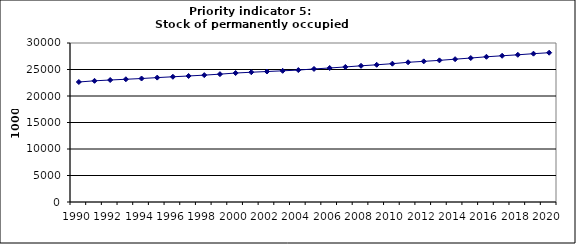
| Category | Stock of permanently occupied dwellings, 1000 |
|---|---|
| 1990 | 22643.922 |
| 1991 | 22862.734 |
| 1992 | 23016.502 |
| 1993 | 23159.711 |
| 1994 | 23298.46 |
| 1995 | 23470.105 |
| 1996 | 23627.609 |
| 1997 | 23777.987 |
| 1998 | 23937.522 |
| 1999 | 24122.857 |
| 2000 | 24333.192 |
| 2001 | 24484.813 |
| 2002 | 24619.142 |
| 2003 | 24752.205 |
| 2004 | 24891.899 |
| 2005 | 25103.747 |
| 2006 | 25287.556 |
| 2007 | 25482.153 |
| 2008 | 25696.72 |
| 2009 | 25888.797 |
| 2010 | 26098.181 |
| 2011 | 26359.744 |
| 2012 | 26536.35 |
| 2013 | 26722.052 |
| 2014 | 26946.595 |
| 2015 | 27164.227 |
| 2016 | 27397.071 |
| 2017 | 27588.628 |
| 2018 | 27772.873 |
| 2019 | 27984.477 |
| 2020 | 28170.181 |